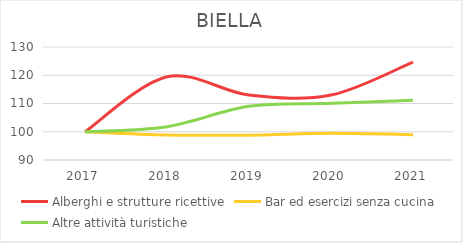
| Category | Alberghi e strutture ricettive | Bar ed esercizi senza cucina | Altre attività turistiche |
|---|---|---|---|
| 2017.0 | 100 | 100 | 100 |
| 2018.0 | 119.481 | 98.89 | 101.799 |
| 2019.0 | 112.987 | 98.804 | 108.993 |
| 2020.0 | 112.987 | 99.488 | 110.072 |
| 2021.0 | 124.675 | 98.975 | 111.151 |